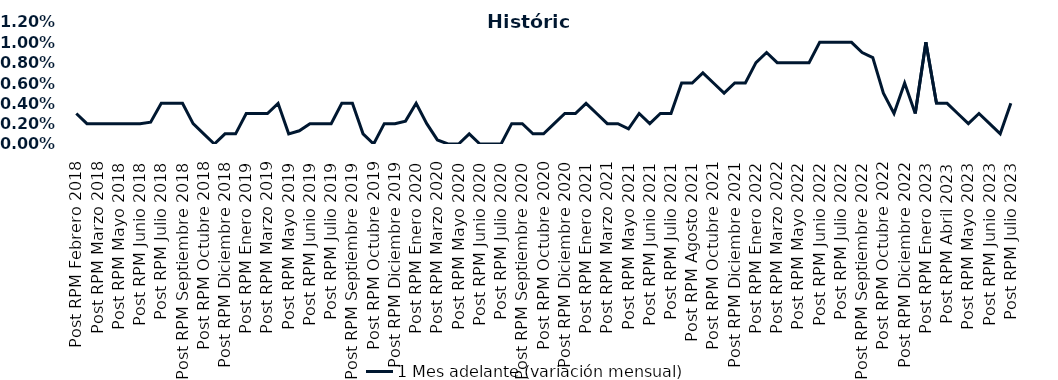
| Category | 1 Mes adelante (variación mensual) |
|---|---|
| Post RPM Febrero 2018 | 0.003 |
| Pre RPM Marzo 2018 | 0.002 |
| Post RPM Marzo 2018 | 0.002 |
| Pre RPM Mayo 2018 | 0.002 |
| Post RPM Mayo 2018 | 0.002 |
| Pre RPM Junio 2018 | 0.002 |
| Post RPM Junio 2018 | 0.002 |
| Pre RPM Julio 2018 | 0.002 |
| Post RPM Julio 2018 | 0.004 |
| Pre RPM Septiembre 2018 | 0.004 |
| Post RPM Septiembre 2018 | 0.004 |
| Pre RPM Octubre 2018 | 0.002 |
| Post RPM Octubre 2018 | 0.001 |
| Pre RPM Diciembre 2018 | 0 |
| Post RPM Diciembre 2018 | 0.001 |
| Pre RPM Enero 2019 | 0.001 |
| Post RPM Enero 2019 | 0.003 |
| Pre RPM Marzo 2019 | 0.003 |
| Post RPM Marzo 2019 | 0.003 |
| Pre RPM Mayo 2019 | 0.004 |
| Post RPM Mayo 2019 | 0.001 |
| Pre RPM Junio 2019 | 0.001 |
| Post RPM Junio 2019 | 0.002 |
| Pre RPM Julio 2019 | 0.002 |
| Post RPM Julio 2019 | 0.002 |
| Pre RPM Septiembre 2019 | 0.004 |
| Post RPM Septiembre 2019 | 0.004 |
| Pre RPM Octubre 2019 | 0.001 |
| Post RPM Octubre 2019 | 0 |
| Pre RPM Diciembre 2019 | 0.002 |
| Post RPM Diciembre 2019 | 0.002 |
| Pre RPM Enero 2020 | 0.002 |
| Post RPM Enero 2020 | 0.004 |
| Pre RPM Marzo 2020 | 0.002 |
| Post RPM Marzo 2020 | 0 |
| Pre RPM Mayo 2020 | 0 |
| Post RPM Mayo 2020 | 0 |
| Pre RPM Junio 2020 | 0.001 |
| Post RPM Junio 2020 | 0 |
| Pre RPM Julio 2020 | 0 |
| Post RPM Julio 2020 | 0 |
| Pre RPM Septiembre 2020 | 0.002 |
| Post RPM Septiembre 2020 | 0.002 |
| Pre RPM Octubre 2020 | 0.001 |
| Post RPM Octubre 2020 | 0.001 |
| Pre RPM Diciembre 2020 | 0.002 |
| Post RPM Diciembre 2020 | 0.003 |
| Pre RPM Enero 2021 | 0.003 |
| Post RPM Enero 2021 | 0.004 |
| Pre RPM Marzo 2021 | 0.003 |
| Post RPM Marzo 2021 | 0.002 |
| Pre RPM Mayo 2021 | 0.002 |
| Post RPM Mayo 2021 | 0.002 |
| Pre RPM Junio 2021 | 0.003 |
| Post RPM Junio 2021 | 0.002 |
| Pre RPM Julio 2021 | 0.003 |
| Post RPM Julio 2021 | 0.003 |
| Pre RPM Agosto 2021 | 0.006 |
| Post RPM Agosto 2021 | 0.006 |
| Pre RPM Octubre 2021 | 0.007 |
| Post RPM Octubre 2021 | 0.006 |
| Pre RPM Diciembre 2021 | 0.005 |
| Post RPM Diciembre 2021 | 0.006 |
| Pre RPM Enero 2022 | 0.006 |
| Post RPM Enero 2022 | 0.008 |
| Pre RPM Marzo 2022 | 0.009 |
| Post RPM Marzo 2022 | 0.008 |
| Pre RPM Mayo 2022 | 0.008 |
| Post RPM Mayo 2022 | 0.008 |
| Pre RPM Junio 2022 | 0.008 |
| Post RPM Junio 2022 | 0.01 |
| Pre RPM Julio 2022 | 0.01 |
| Post RPM Julio 2022 | 0.01 |
| Pre RPM Septiembre 2022 | 0.01 |
| Post RPM Septiembre 2022 | 0.009 |
| Pre RPM Octubre 2022 | 0.008 |
| Post RPM Octubre 2022 | 0.005 |
| Pre RPM Diciembre 2022 | 0.003 |
| Post RPM Diciembre 2022 | 0.006 |
| Pre RPM Enero 2023 | 0.003 |
| Post RPM Enero 2023 | 0.01 |
| Pre RPM Abril 2023 | 0.004 |
| Post RPM Abril 2023 | 0.004 |
| Pre RPM Mayo 2023 | 0.003 |
| Post RPM Mayo 2023 | 0.002 |
| Pre RPM Junio 2023 | 0.003 |
| Post RPM Junio 2023 | 0.002 |
| Pre RPM Julio 2023 | 0.001 |
| Post RPM Julio 2023 | 0.004 |